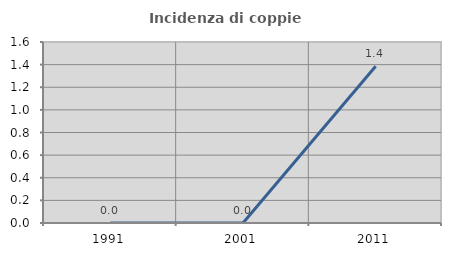
| Category | Incidenza di coppie miste |
|---|---|
| 1991.0 | 0 |
| 2001.0 | 0 |
| 2011.0 | 1.385 |